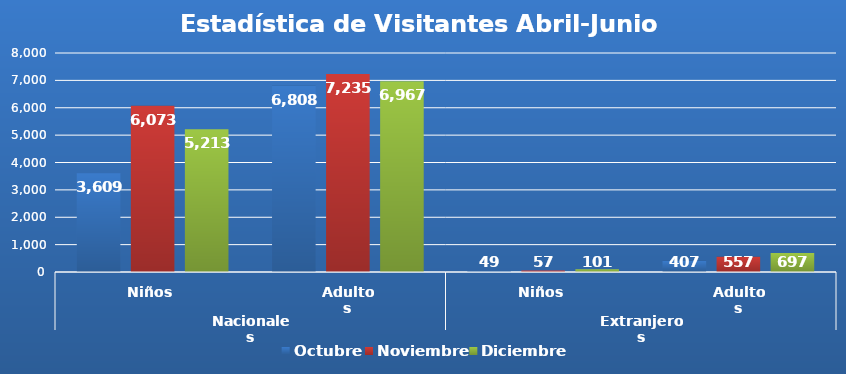
| Category | Octubre | Noviembre | Diciembre |
|---|---|---|---|
| 0 | 3609 | 6073 | 5213 |
| 1 | 6808 | 7235 | 6967 |
| 2 | 49 | 57 | 101 |
| 3 | 407 | 557 | 697 |